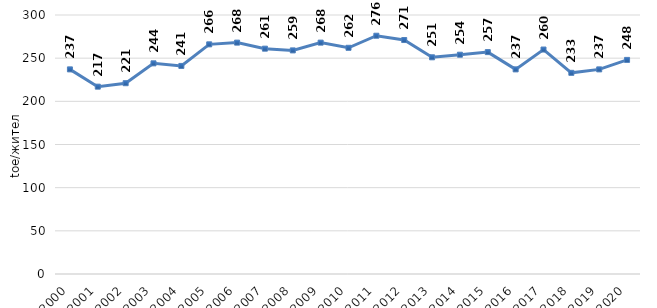
| Category | toe/жител |
|---|---|
| 2000.0 | 237 |
| 2001.0 | 217 |
| 2002.0 | 221 |
| 2003.0 | 244 |
| 2004.0 | 241 |
| 2005.0 | 266 |
| 2006.0 | 268 |
| 2007.0 | 261 |
| 2008.0 | 259 |
| 2009.0 | 268 |
| 2010.0 | 262 |
| 2011.0 | 276 |
| 2012.0 | 271 |
| 2013.0 | 251 |
| 2014.0 | 254 |
| 2015.0 | 257 |
| 2016.0 | 237 |
| 2017.0 | 260 |
| 2018.0 | 233 |
| 2019.0 | 237 |
| 2020.0 | 248 |